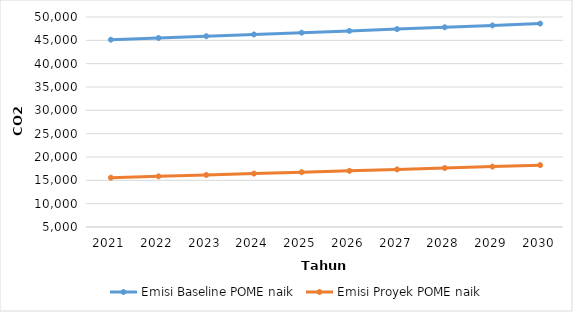
| Category | Emisi Baseline POME naik | Emisi Proyek POME naik |
|---|---|---|
| 2021.0 | 45135.93 | 15568.661 |
| 2022.0 | 45507.088 | 15857.605 |
| 2023.0 | 45881.298 | 16148.926 |
| 2024.0 | 46258.586 | 16442.642 |
| 2025.0 | 46638.976 | 16738.773 |
| 2026.0 | 47022.494 | 17037.34 |
| 2027.0 | 47409.166 | 17338.361 |
| 2028.0 | 47799.018 | 17641.858 |
| 2029.0 | 48192.075 | 17947.851 |
| 2030.0 | 48588.364 | 18256.36 |